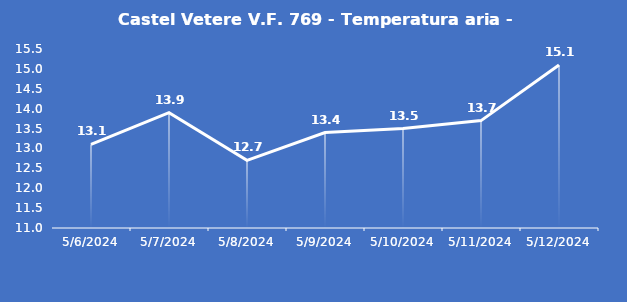
| Category | Castel Vetere V.F. 769 - Temperatura aria - Grezzo (°C) |
|---|---|
| 5/6/24 | 13.1 |
| 5/7/24 | 13.9 |
| 5/8/24 | 12.7 |
| 5/9/24 | 13.4 |
| 5/10/24 | 13.5 |
| 5/11/24 | 13.7 |
| 5/12/24 | 15.1 |